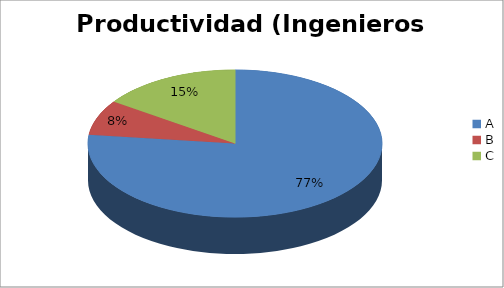
| Category | Series 0 |
|---|---|
| A | 76.923 |
| B | 7.692 |
| C | 15.385 |